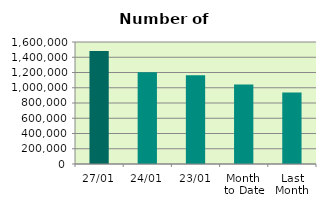
| Category | Series 0 |
|---|---|
| 27/01 | 1481000 |
| 24/01 | 1202610 |
| 23/01 | 1163232 |
| Month 
to Date | 1042437.333 |
| Last
Month | 938735.9 |